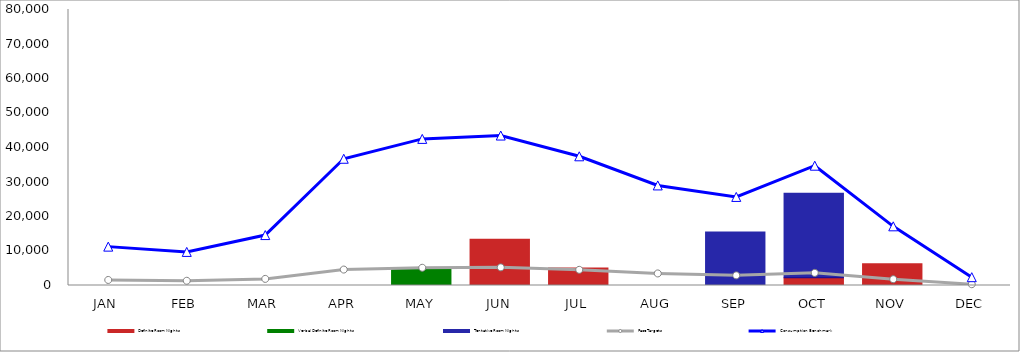
| Category | Definite Room Nights | Verbal Definite Room Nights | Tentative Room Nights |
|---|---|---|---|
| JAN | 0 | 0 | 0 |
| FEB | 0 | 0 | 0 |
| MAR | 0 | 0 | 0 |
| APR | 0 | 0 | 0 |
| MAY | 0 | 5000 | 0 |
| JUN | 13408 | 0 | 0 |
| JUL | 5044 | 0 | 0 |
| AUG | 0 | 0 | 0 |
| SEP | 0 | 0 | 15490 |
| OCT | 2245 | 0 | 24484 |
| NOV | 6317 | 0 | 0 |
| DEC | 0 | 0 | 0 |